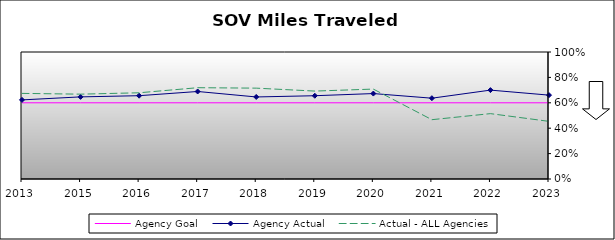
| Category | Agency Goal | Agency Actual | Actual - ALL Agencies |
|---|---|---|---|
| 2013.0 | 0.6 | 0.623 | 0.674 |
| 2015.0 | 0.6 | 0.647 | 0.668 |
| 2016.0 | 0.6 | 0.656 | 0.679 |
| 2017.0 | 0.6 | 0.689 | 0.719 |
| 2018.0 | 0.6 | 0.646 | 0.715 |
| 2019.0 | 0.6 | 0.656 | 0.692 |
| 2020.0 | 0.6 | 0.673 | 0.708 |
| 2021.0 | 0.6 | 0.636 | 0.467 |
| 2022.0 | 0.6 | 0.7 | 0.515 |
| 2023.0 | 0.6 | 0.66 | 0.454 |